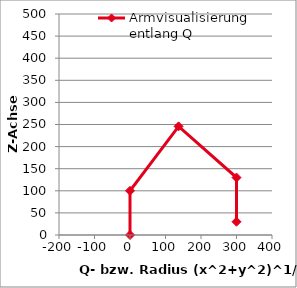
| Category | Armvisualisierung entlang Q |
|---|---|
| 0.0 | 0 |
| 0.0 | 100 |
| 136.92178896177327 | 245.782 |
| 300.0 | 130 |
| 300.0 | 30 |